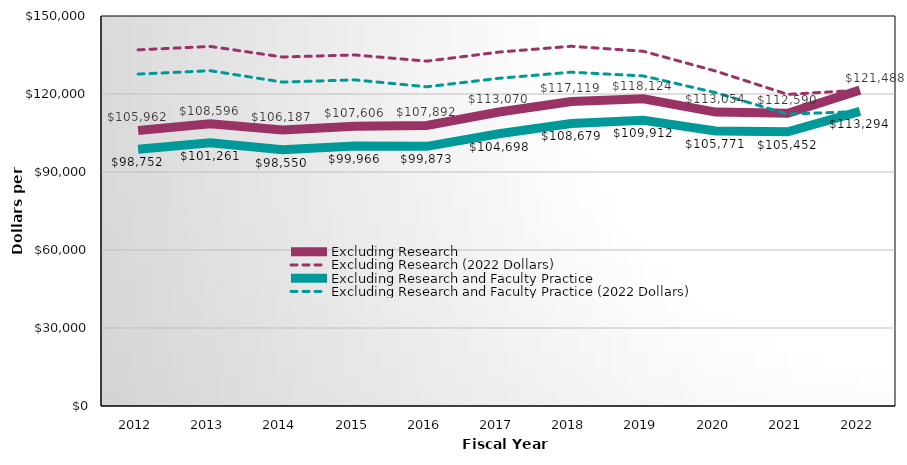
| Category | Excluding Research | Excluding Research (2022 Dollars) | Excluding Research and Faculty Practice | Excluding Research and Faculty Practice (2022 Dollars) |
|---|---|---|---|---|
| 2012.0 | 105962 | 136978.212 | 98752 | 127657.768 |
| 2013.0 | 108596 | 138298.474 | 101261 | 128957.252 |
| 2014.0 | 106187 | 134231.41 | 98550 | 124577.447 |
| 2015.0 | 107606 | 135024.696 | 99966 | 125437.976 |
| 2016.0 | 107892 | 132631.744 | 99873 | 122773.979 |
| 2017.0 | 113070 | 136122.016 | 104698 | 126043.185 |
| 2018.0 | 117119 | 138365.392 | 108679 | 128394.304 |
| 2019.0 | 118124 | 136428.396 | 109912 | 126943.871 |
| 2020.0 | 113054 | 128830.233 | 105771 | 120530.92 |
| 2021.0 | 112590 | 119845.687 | 105452 | 112247.69 |
| 2022.0 | 121488 | 121488 | 113294 | 113294 |